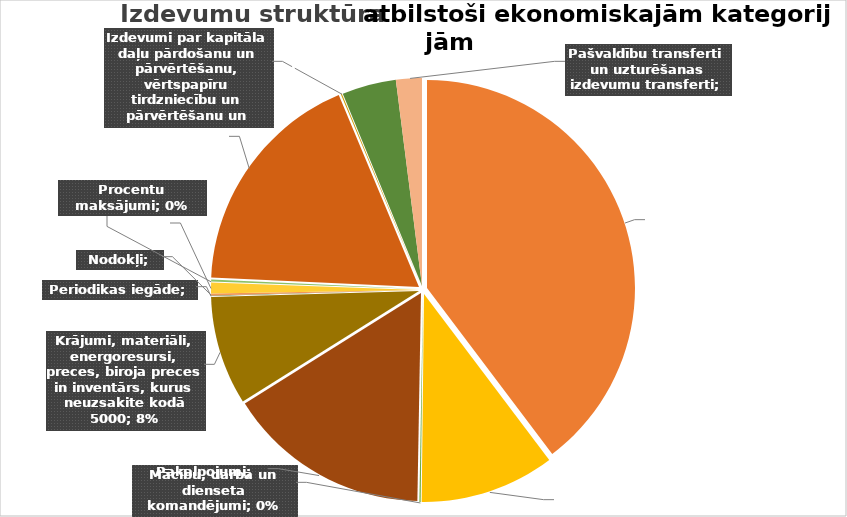
| Category | Series 0 |
|---|---|
| Atalgojums | 17334098 |
| DD VSAOI | 4565837 |
| Mācību, darba un dienseta komandējumi | 43997 |
| Pakalpojumi | 6895693 |
| Krājumi, materiāli, energoresursi, preces, biroja preces in inventārs, kurus neuzsakite kodā 5000 | 3692019 |
| Periodikas iegāde | 22275 |
| Nodokļi | 60517 |
| Subsīdijas un dotācijas | 370065 |
| Procentu maksājumi | 64440 |
| Nemateriālie ieguldījumi, pamatlīdzekļi | 7844464 |
| Izdevumi par kapitāla daļu pārdošanu un pārvērtēšanu, vērtspapīru tirdzniecību un pārvērtēšanu un kapitāla daļu iegādi | 37600 |
| Pabalsti, dotācijas | 1836627 |
| Pašvaldību transferti un uzturēšanas izdevumu transferti | 877403 |